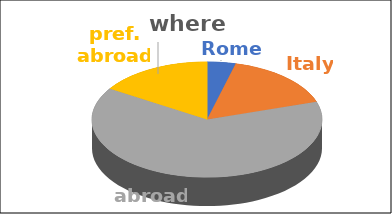
| Category | where | Series 1 | Series 2 | Series 3 | Series 4 |
|---|---|---|---|---|---|
| Rome | 0.04 |  |  |  |  |
| Italy | 0.16 |  |  |  |  |
| abroad | 0.64 |  |  |  |  |
| pref. abroad | 0.16 |  |  |  |  |